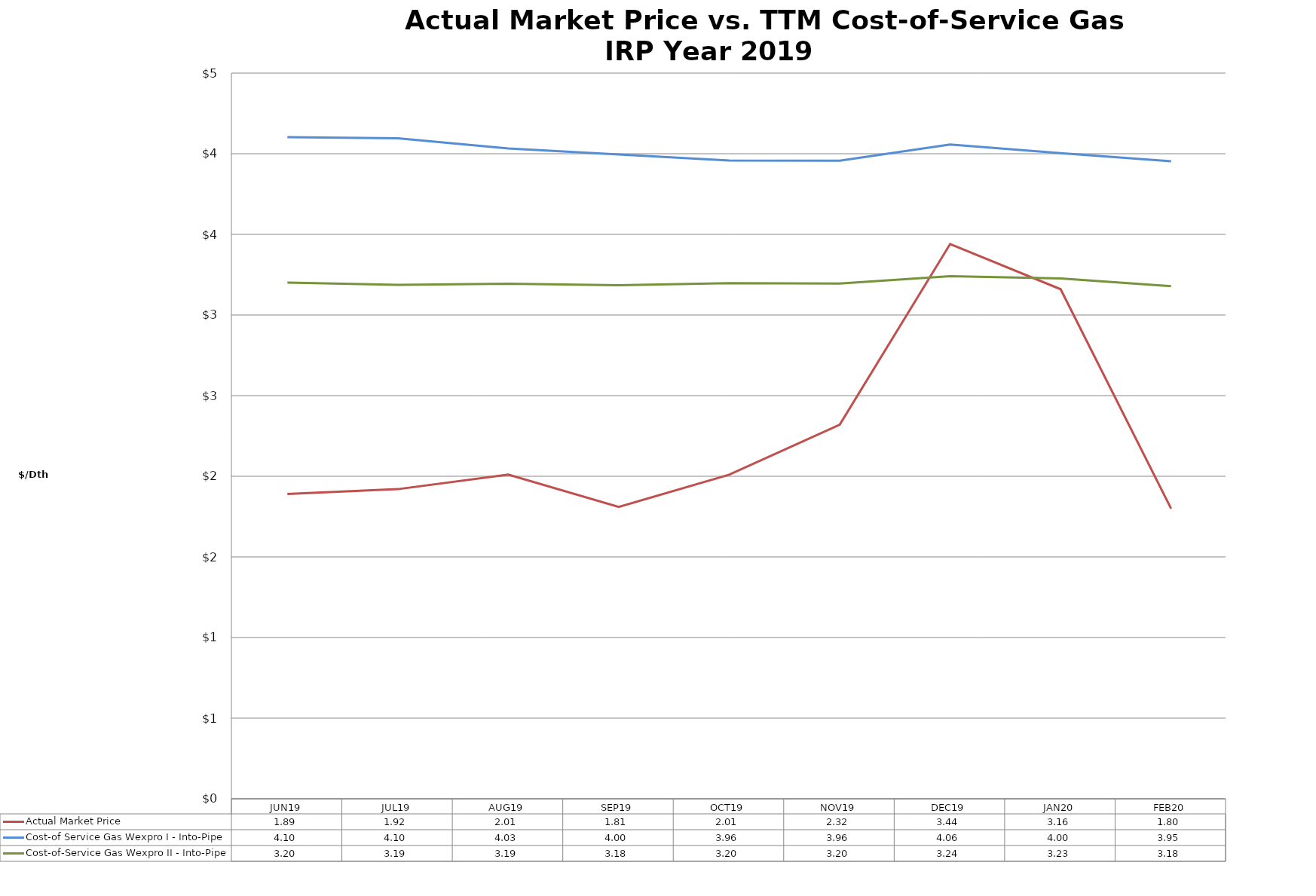
| Category | Actual Market Price | Cost-of Service Gas Wexpro I - Into-Pipe | Cost-of-Service Gas Wexpro II - Into-Pipe |
|---|---|---|---|
| JUN19 | 1.89 | 4.103 | 3.201 |
| JUL19 | 1.92 | 4.096 | 3.187 |
| AUG19 | 2.01 | 4.033 | 3.194 |
| SEP19 | 1.81 | 3.995 | 3.184 |
| OCT19 | 2.01 | 3.958 | 3.197 |
| NOV19 | 2.32 | 3.957 | 3.195 |
| DEC19 | 3.44 | 4.057 | 3.241 |
| JAN20 | 3.16 | 4.003 | 3.227 |
| FEB20 | 1.8 | 3.954 | 3.179 |